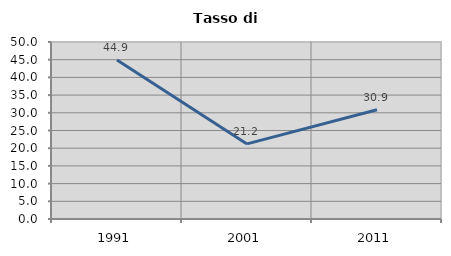
| Category | Tasso di disoccupazione   |
|---|---|
| 1991.0 | 44.944 |
| 2001.0 | 21.212 |
| 2011.0 | 30.864 |